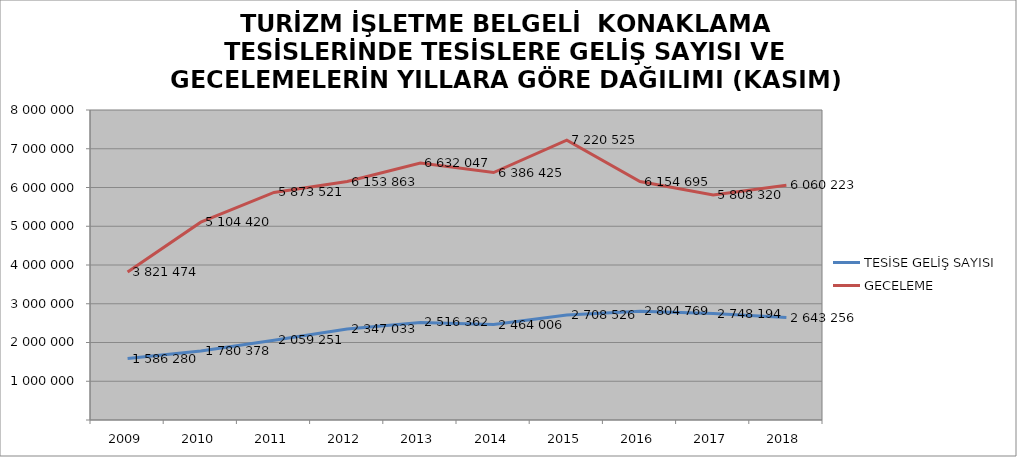
| Category | TESİSE GELİŞ SAYISI | GECELEME |
|---|---|---|
| 2009 | 1586280 | 3821474 |
| 2010 | 1780378 | 5104420 |
| 2011 | 2059251 | 5873521 |
| 2012 | 2347033 | 6153863 |
| 2013 | 2516362 | 6632047 |
| 2014 | 2464006 | 6386425 |
| 2015 | 2708526 | 7220525 |
| 2016 | 2804769 | 6154695 |
| 2017 | 2748194 | 5808320 |
| 2018 | 2643256 | 6060223 |